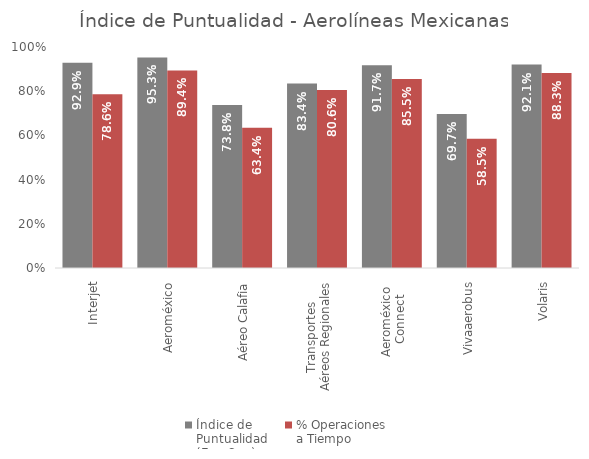
| Category | Índice de 
Puntualidad
(Ene-Sep) | % Operaciones 
a Tiempo |
|---|---|---|
| Interjet | 0.929 | 0.786 |
| Aeroméxico | 0.953 | 0.894 |
| Aéreo Calafia | 0.738 | 0.634 |
| Transportes 
Aéreos Regionales | 0.834 | 0.806 |
| Aeroméxico 
Connect | 0.917 | 0.855 |
| Vivaaerobus | 0.697 | 0.585 |
| Volaris | 0.921 | 0.883 |